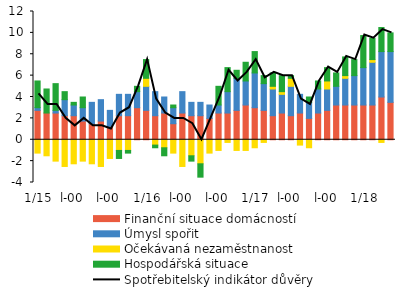
| Category | Finanční situace domácností | Úmysl spořit | Očekávaná nezaměstnanost | Hospodářská situace |
|---|---|---|---|---|
|  1/15 | 2.75 | 0.25 | -1.25 | 2.5 |
| 2 | 2.5 | 0 | -1.5 | 2.25 |
| 3 | 2.5 | 0.25 | -2 | 2.5 |
| 4 | 2.25 | 1.5 | -2.5 | 0.75 |
| 5 | 2.25 | 1 | -2.25 | 0.25 |
| 6 | 1.75 | 1.25 | -2 | 1 |
| 7 | 1.5 | 2 | -2.25 | 0 |
| 8 | 1.75 | 2 | -2.5 | 0 |
| 9 | 1.25 | 1.5 | -1.75 | 0 |
| 10 | 2.25 | 2 | -1 | -0.75 |
| 11 | 2.25 | 2 | -1 | -0.25 |
| 12 | 3 | 1.5 | 0 | 0.5 |
|  1/16 | 2.75 | 2.25 | 0.75 | 1.75 |
| 2 | 2.25 | 2.25 | -0.5 | -0.25 |
| 3 | 2.5 | 1.5 | -0.75 | -0.75 |
| 4 | 1.5 | 1.5 | -1.25 | 0.25 |
| 5 | 2.5 | 2 | -2.5 | 0 |
| 6 | 2.25 | 1.25 | -1.5 | -0.5 |
| 7 | 2.25 | 1.25 | -2.25 | -1.25 |
| 8 | 2 | 1.25 | -1.25 | 0 |
| 9 | 2.5 | 0.75 | -1 | 1.75 |
| 10 | 2.5 | 2 | -0.25 | 2.25 |
| 11 | 2.75 | 3 | -1 | 0.75 |
| 12 | 3.25 | 2.25 | -1 | 1.75 |
|  1/17 | 3 | 3.25 | -0.75 | 2 |
| 2 | 2.75 | 2.5 | -0.25 | 0.75 |
| 3 | 2.25 | 2.5 | 0.25 | 1.25 |
| 4 | 2.5 | 1.75 | 0.25 | 1.5 |
| 5 | 2.25 | 2.75 | 0.75 | 0.25 |
| 6 | 2.5 | 1.75 | -0.5 | 0 |
| 7 | 2 | 1.5 | -0.75 | 0.5 |
| 8 | 2.5 | 2.25 | 0 | 0.75 |
| 9 | 2.75 | 2 | 0.75 | 1.25 |
| 10 | 3.25 | 1.75 | 0 | 1.25 |
| 11 | 3.25 | 2.5 | 0.25 | 1.75 |
| 12 | 3.25 | 2.75 | 0 | 1.5 |
|  1/18 | 3.25 | 3.5 | 0 | 3 |
| 2 | 3.25 | 4 | 0.25 | 2 |
| 3 | 4 | 4.25 | -0.25 | 2.25 |
| 4 | 3.5 | 4.75 | 0 | 1.75 |